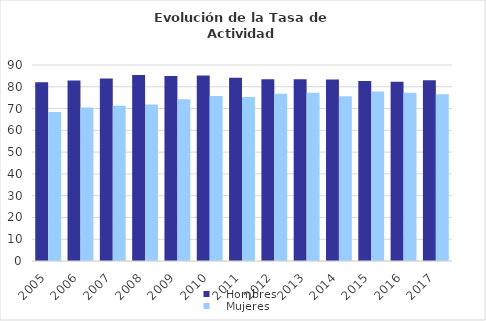
| Category |    Hombres |    Mujeres |
|---|---|---|
| 2005.0 | 82.06 | 68.401 |
| 2006.0 | 82.859 | 70.512 |
| 2007.0 | 83.791 | 71.239 |
| 2008.0 | 85.425 | 71.92 |
| 2009.0 | 84.95 | 74.257 |
| 2010.0 | 85.189 | 75.75 |
| 2011.0 | 84.17 | 75.314 |
| 2012.0 | 83.443 | 76.776 |
| 2013.0 | 83.446 | 77.244 |
| 2014.0 | 83.379 | 75.651 |
| 2015.0 | 82.684 | 77.777 |
| 2016.0 | 82.353 | 77.211 |
| 2017.0 | 82.997 | 76.536 |